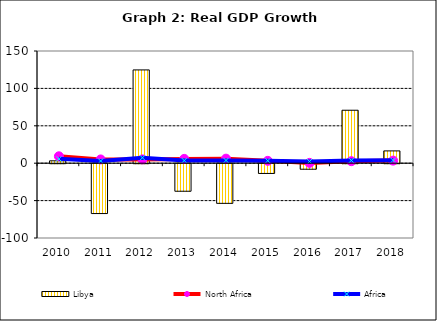
| Category | Libya |
|---|---|
| 2010.0 | 3.176 |
| 2011.0 | -66.657 |
| 2012.0 | 124.709 |
| 2013.0 | -36.829 |
| 2014.0 | -53.017 |
| 2015.0 | -13.023 |
| 2016.0 | -7.389 |
| 2017.0 | 70.804 |
| 2018.0 | 16.437 |